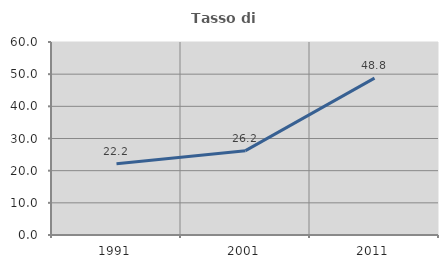
| Category | Tasso di occupazione   |
|---|---|
| 1991.0 | 22.15 |
| 2001.0 | 26.219 |
| 2011.0 | 48.775 |